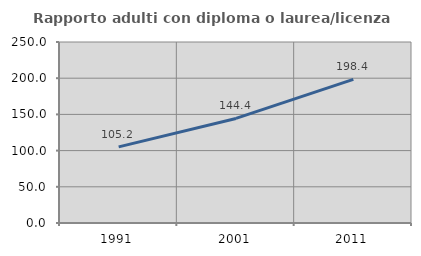
| Category | Rapporto adulti con diploma o laurea/licenza media  |
|---|---|
| 1991.0 | 105.168 |
| 2001.0 | 144.449 |
| 2011.0 | 198.4 |